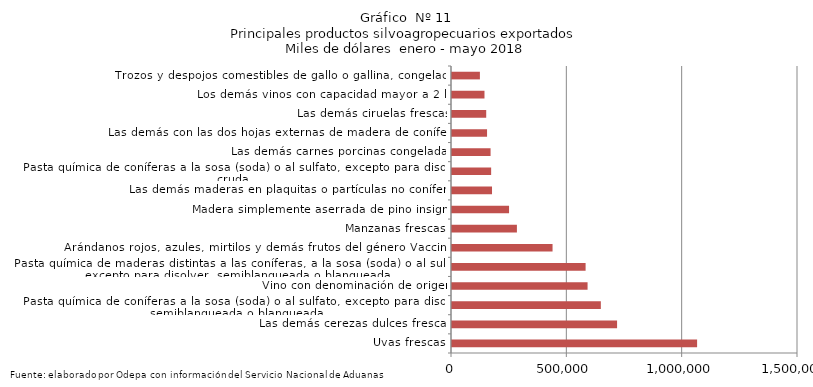
| Category | Series 0 |
|---|---|
| Uvas frescas | 1062587.315 |
| Las demás cerezas dulces frescas | 715671.037 |
| Pasta química de coníferas a la sosa (soda) o al sulfato, excepto para disolver, semiblanqueada o blanqueada | 645236.492 |
| Vino con denominación de origen | 587731.329 |
| Pasta química de maderas distintas a las coníferas, a la sosa (soda) o al sulfato, excepto para disolver, semiblanqueada o blanqueada | 579176.188 |
| Arándanos rojos, azules, mirtilos y demás frutos del género Vaccinium | 435899.058 |
| Manzanas frescas | 281393.398 |
| Madera simplemente aserrada de pino insigne | 247354.646 |
| Las demás maderas en plaquitas o partículas no coníferas | 173466.435 |
| Pasta química de coníferas a la sosa (soda) o al sulfato, excepto para disolver, cruda | 169688.526 |
| Las demás carnes porcinas congeladas | 167229.737 |
| Las demás con las dos hojas externas de madera de coníferas | 151985.598 |
| Las demás ciruelas frescas | 148309.837 |
| Los demás vinos con capacidad mayor a 2 lts | 140826.534 |
| Trozos y despojos comestibles de gallo o gallina, congelados | 120945.255 |